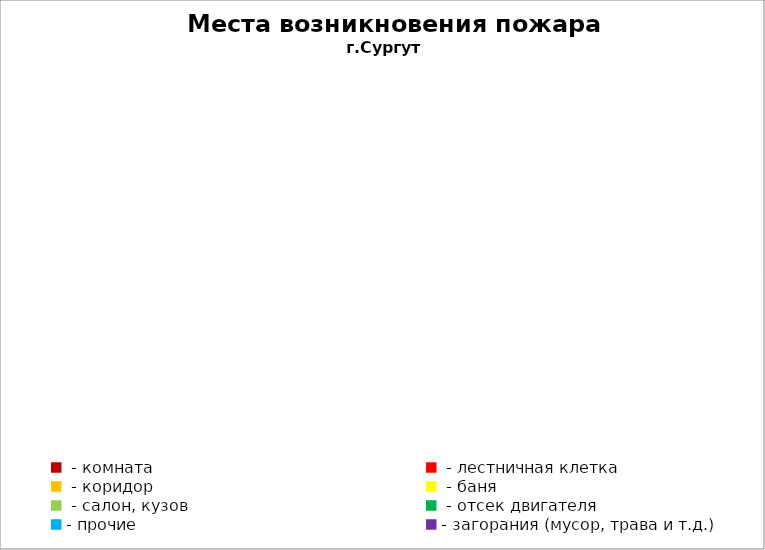
| Category | Места возникновения пожара |
|---|---|
|  - комната | 42 |
|  - лестничная клетка | 11 |
|  - коридор | 6 |
|  - баня | 13 |
|  - салон, кузов | 5 |
|  - отсек двигателя | 10 |
| - прочие | 53 |
| - загорания (мусор, трава и т.д.)  | 93 |